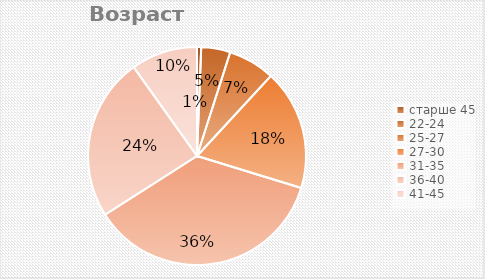
| Category | количество |
|---|---|
| старше 45 | 4 |
| 22-24 | 28 |
| 25-27 | 45 |
| 27-30 | 116 |
| 31-35 | 235 |
| 36-40 | 157 |
| 41-45 | 64 |